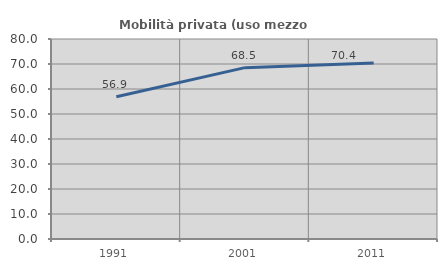
| Category | Mobilità privata (uso mezzo privato) |
|---|---|
| 1991.0 | 56.893 |
| 2001.0 | 68.544 |
| 2011.0 | 70.445 |